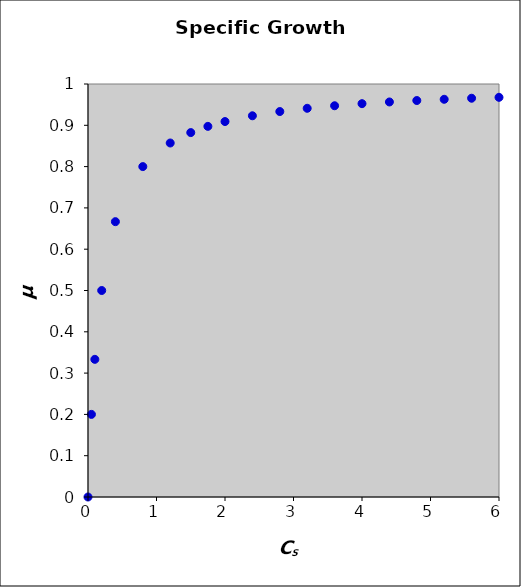
| Category | mu |
|---|---|
| 0.0 | 0 |
| 0.05 | 0.2 |
| 0.1 | 0.333 |
| 0.2 | 0.5 |
| 0.4 | 0.667 |
| 0.8 | 0.8 |
| 1.2 | 0.857 |
| 1.5 | 0.882 |
| 1.75 | 0.897 |
| 2.0 | 0.909 |
| 2.4 | 0.923 |
| 2.8 | 0.933 |
| 3.2 | 0.941 |
| 3.6 | 0.947 |
| 4.0 | 0.952 |
| 4.4 | 0.957 |
| 4.8 | 0.96 |
| 5.2 | 0.963 |
| 5.6 | 0.966 |
| 6.0 | 0.968 |